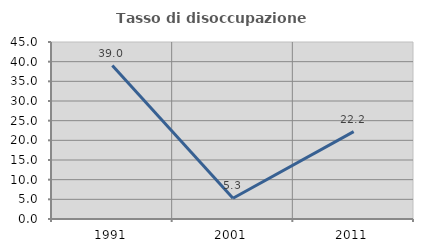
| Category | Tasso di disoccupazione giovanile  |
|---|---|
| 1991.0 | 39.024 |
| 2001.0 | 5.263 |
| 2011.0 | 22.222 |